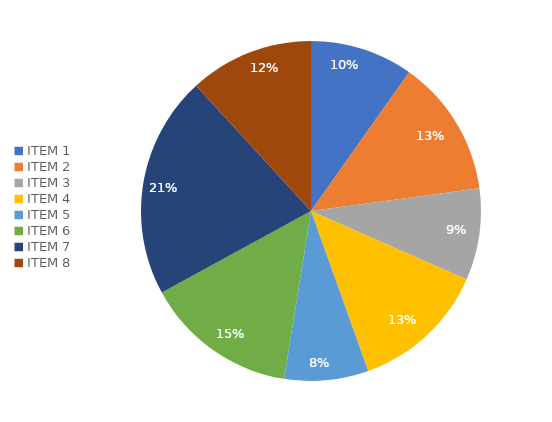
| Category | Series 0 | Series 1 |
|---|---|---|
| ITEM 1 | 0.098 | 0.098 |
| ITEM 2 | 0.131 | 0.131 |
| ITEM 3 | 0.087 | 0.087 |
| ITEM 4 | 0.129 | 0.129 |
| ITEM 5 | 0.08 | 0.08 |
| ITEM 6 | 0.145 | 0.145 |
| ITEM 7 | 0.211 | 0.211 |
| ITEM 8 | 0.118 | 0.118 |